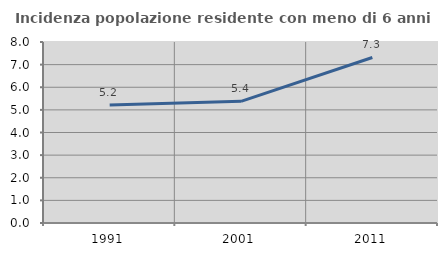
| Category | Incidenza popolazione residente con meno di 6 anni |
|---|---|
| 1991.0 | 5.22 |
| 2001.0 | 5.376 |
| 2011.0 | 7.316 |